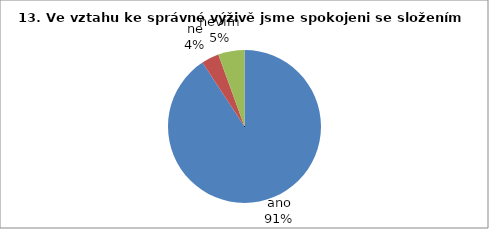
| Category | 13. |
|---|---|
| ano | 49 |
| ne | 2 |
| nevím | 3 |